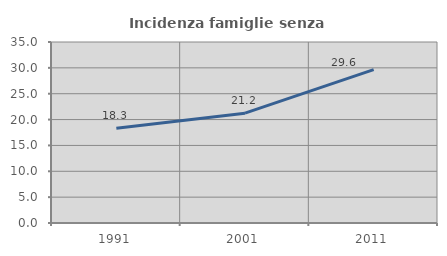
| Category | Incidenza famiglie senza nuclei |
|---|---|
| 1991.0 | 18.305 |
| 2001.0 | 21.232 |
| 2011.0 | 29.649 |